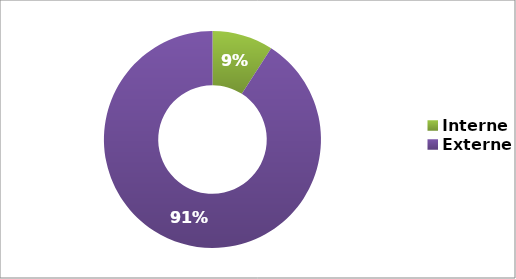
| Category | Series 0 |
|---|---|
| Interne | 0.091 |
| Externe | 0.909 |